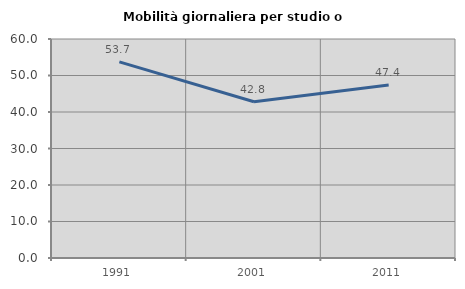
| Category | Mobilità giornaliera per studio o lavoro |
|---|---|
| 1991.0 | 53.74 |
| 2001.0 | 42.807 |
| 2011.0 | 47.398 |